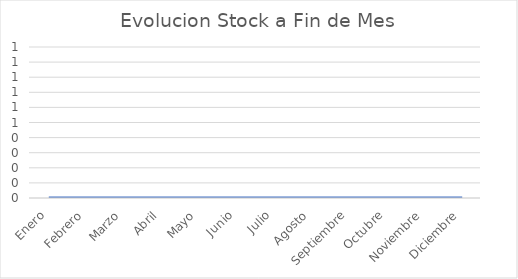
| Category | Stock Fin Mes |
|---|---|
| Enero | 0 |
| Febrero | 0 |
| Marzo | 0 |
| Abril | 0 |
| Mayo | 0 |
| Junio | 0 |
| Julio | 0 |
| Agosto | 0 |
| Septiembre | 0 |
| Octubre | 0 |
| Noviembre | 0 |
| Diciembre | 0 |